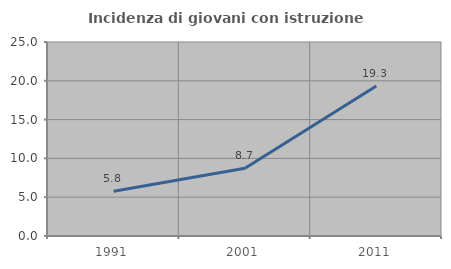
| Category | Incidenza di giovani con istruzione universitaria |
|---|---|
| 1991.0 | 5.778 |
| 2001.0 | 8.74 |
| 2011.0 | 19.33 |